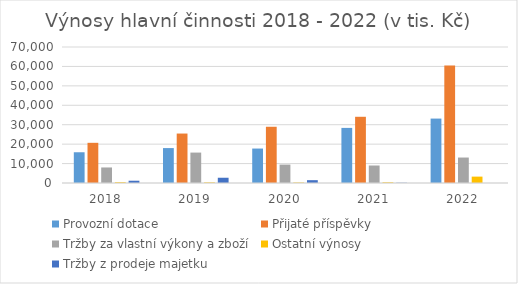
| Category | Provozní dotace | Přijaté příspěvky | Tržby za vlastní výkony a zboží | Ostatní výnosy | Tržby z prodeje majetku |
|---|---|---|---|---|---|
| 2018.0 | 15825 | 20683 | 7997 | 413 | 1174 |
| 2019.0 | 17976 | 25455 | 15656 | 312 | 2705 |
| 2020.0 | 17731 | 28945 | 9476 | 244 | 1456 |
| 2021.0 | 28361 | 34083 | 9009 | 346 | 120 |
| 2022.0 | 33158 | 60521 | 13104 | 3285 | 0 |